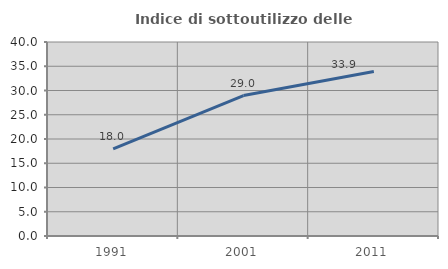
| Category | Indice di sottoutilizzo delle abitazioni  |
|---|---|
| 1991.0 | 17.95 |
| 2001.0 | 28.965 |
| 2011.0 | 33.922 |